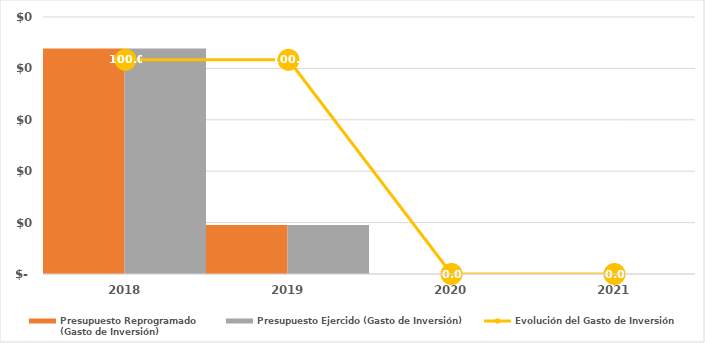
| Category | Presupuesto Reprogramado
(Gasto de Inversión) | Presupuesto Ejercido (Gasto de Inversión) |
|---|---|---|
| 2018.0 | 21.924 | 21.924 |
| 2019.0 | 4.77 | 4.77 |
| 2020.0 | 0 | 0 |
| 2021.0 | 0 | 0 |